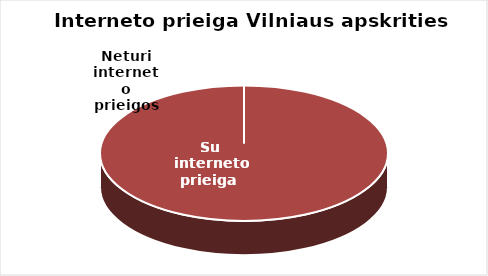
| Category | Series 0 |
|---|---|
| Su interneto prieiga  | 182 |
| Neturi interneto prieigos | 0 |